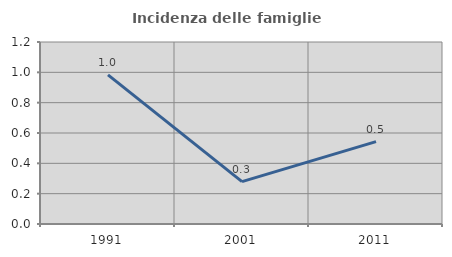
| Category | Incidenza delle famiglie numerose |
|---|---|
| 1991.0 | 0.984 |
| 2001.0 | 0.279 |
| 2011.0 | 0.543 |